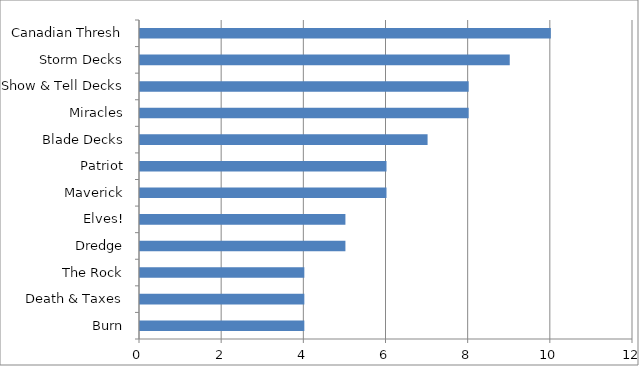
| Category | Series 0 |
|---|---|
| Burn | 4 |
| Death & Taxes | 4 |
| The Rock | 4 |
| Dredge | 5 |
| Elves! | 5 |
| Maverick | 6 |
| Patriot | 6 |
| Blade Decks | 7 |
| Miracles | 8 |
| Show & Tell Decks | 8 |
| Storm Decks | 9 |
| Canadian Thresh | 10 |